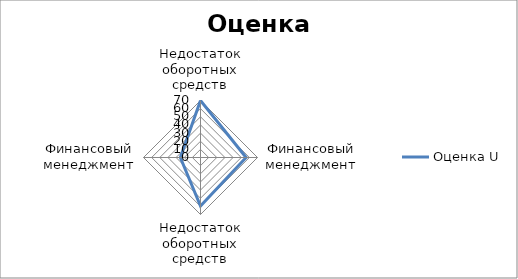
| Category | Оценка U |
|---|---|
| Недостаток оборотных средств | 70 |
| Финансовый менеджмент | 56 |
| Недостаток оборотных средств | 59.63 |
| Финансовый менеджмент | 24.75 |